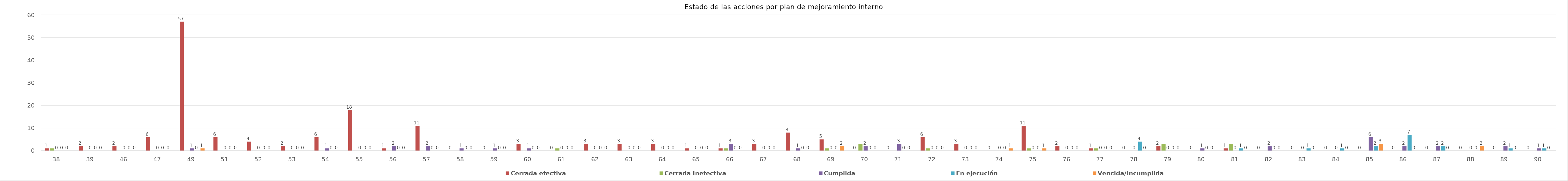
| Category | Cerrada efectiva | Cerrada Inefectiva | Cumplida | En ejecución | Vencida/Incumplida |
|---|---|---|---|---|---|
| 38.0 | 1 | 1 | 0 | 0 | 0 |
| 39.0 | 2 | 0 | 0 | 0 | 0 |
| 46.0 | 2 | 0 | 0 | 0 | 0 |
| 47.0 | 6 | 0 | 0 | 0 | 0 |
| 49.0 | 57 | 0 | 1 | 0 | 1 |
| 51.0 | 6 | 0 | 0 | 0 | 0 |
| 52.0 | 4 | 0 | 0 | 0 | 0 |
| 53.0 | 2 | 0 | 0 | 0 | 0 |
| 54.0 | 6 | 0 | 1 | 0 | 0 |
| 55.0 | 18 | 0 | 0 | 0 | 0 |
| 56.0 | 1 | 0 | 2 | 0 | 0 |
| 57.0 | 11 | 0 | 2 | 0 | 0 |
| 58.0 | 0 | 0 | 1 | 0 | 0 |
| 59.0 | 0 | 0 | 1 | 0 | 0 |
| 60.0 | 3 | 0 | 1 | 0 | 0 |
| 61.0 | 0 | 1 | 0 | 0 | 0 |
| 62.0 | 3 | 0 | 0 | 0 | 0 |
| 63.0 | 3 | 0 | 0 | 0 | 0 |
| 64.0 | 3 | 0 | 0 | 0 | 0 |
| 65.0 | 1 | 0 | 0 | 0 | 0 |
| 66.0 | 1 | 1 | 3 | 0 | 0 |
| 67.0 | 3 | 0 | 0 | 0 | 0 |
| 68.0 | 8 | 0 | 1 | 0 | 0 |
| 69.0 | 5 | 1 | 0 | 0 | 2 |
| 70.0 | 0 | 3 | 2 | 0 | 0 |
| 71.0 | 0 | 0 | 3 | 0 | 0 |
| 72.0 | 6 | 1 | 0 | 0 | 0 |
| 73.0 | 3 | 0 | 0 | 0 | 0 |
| 74.0 | 0 | 0 | 0 | 0 | 1 |
| 75.0 | 11 | 1 | 0 | 0 | 1 |
| 76.0 | 2 | 0 | 0 | 0 | 0 |
| 77.0 | 1 | 1 | 0 | 0 | 0 |
| 78.0 | 0 | 0 | 0 | 4 | 0 |
| 79.0 | 2 | 3 | 0 | 0 | 0 |
| 80.0 | 0 | 0 | 1 | 0 | 0 |
| 81.0 | 1 | 3 | 0 | 1 | 0 |
| 82.0 | 0 | 0 | 2 | 0 | 0 |
| 83.0 | 0 | 0 | 0 | 1 | 0 |
| 84.0 | 0 | 0 | 0 | 1 | 0 |
| 85.0 | 0 | 0 | 6 | 2 | 3 |
| 86.0 | 0 | 0 | 2 | 7 | 0 |
| 87.0 | 0 | 0 | 2 | 2 | 0 |
| 88.0 | 0 | 0 | 0 | 0 | 2 |
| 89.0 | 0 | 0 | 2 | 1 | 0 |
| 90.0 | 0 | 0 | 1 | 1 | 0 |